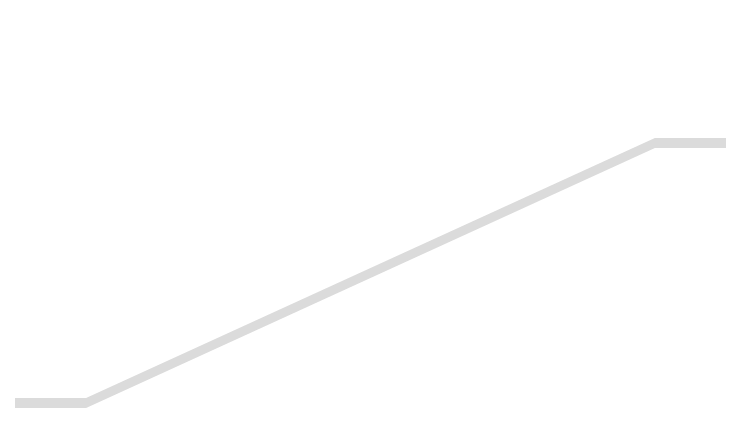
| Category | Series 0 | Series 1 | Series 2 |
|---|---|---|---|
| 0.0 | 3687.012 | 95.514 | 230.635 |
| 10.0 | 3687.012 | 95.514 | 230.635 |
| 90.0 | 1184.34 | 95.514 | 2733.306 |
| 100.0 | 1184.34 | 95.514 | 2733.306 |